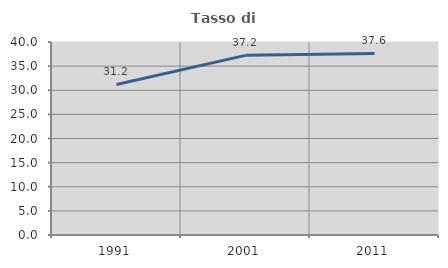
| Category | Tasso di occupazione   |
|---|---|
| 1991.0 | 31.206 |
| 2001.0 | 37.234 |
| 2011.0 | 37.634 |